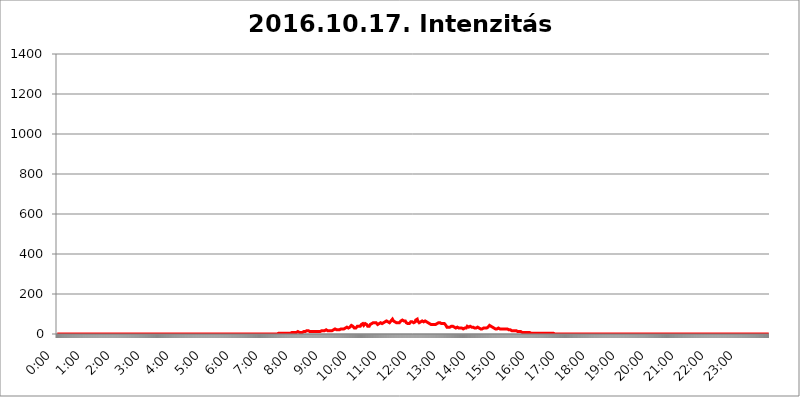
| Category | 2016.10.17. Intenzitás [W/m^2] |
|---|---|
| 0.0 | 0 |
| 0.0006944444444444445 | 0 |
| 0.001388888888888889 | 0 |
| 0.0020833333333333333 | 0 |
| 0.002777777777777778 | 0 |
| 0.003472222222222222 | 0 |
| 0.004166666666666667 | 0 |
| 0.004861111111111111 | 0 |
| 0.005555555555555556 | 0 |
| 0.0062499999999999995 | 0 |
| 0.006944444444444444 | 0 |
| 0.007638888888888889 | 0 |
| 0.008333333333333333 | 0 |
| 0.009027777777777779 | 0 |
| 0.009722222222222222 | 0 |
| 0.010416666666666666 | 0 |
| 0.011111111111111112 | 0 |
| 0.011805555555555555 | 0 |
| 0.012499999999999999 | 0 |
| 0.013194444444444444 | 0 |
| 0.013888888888888888 | 0 |
| 0.014583333333333332 | 0 |
| 0.015277777777777777 | 0 |
| 0.015972222222222224 | 0 |
| 0.016666666666666666 | 0 |
| 0.017361111111111112 | 0 |
| 0.018055555555555557 | 0 |
| 0.01875 | 0 |
| 0.019444444444444445 | 0 |
| 0.02013888888888889 | 0 |
| 0.020833333333333332 | 0 |
| 0.02152777777777778 | 0 |
| 0.022222222222222223 | 0 |
| 0.02291666666666667 | 0 |
| 0.02361111111111111 | 0 |
| 0.024305555555555556 | 0 |
| 0.024999999999999998 | 0 |
| 0.025694444444444447 | 0 |
| 0.02638888888888889 | 0 |
| 0.027083333333333334 | 0 |
| 0.027777777777777776 | 0 |
| 0.02847222222222222 | 0 |
| 0.029166666666666664 | 0 |
| 0.029861111111111113 | 0 |
| 0.030555555555555555 | 0 |
| 0.03125 | 0 |
| 0.03194444444444445 | 0 |
| 0.03263888888888889 | 0 |
| 0.03333333333333333 | 0 |
| 0.034027777777777775 | 0 |
| 0.034722222222222224 | 0 |
| 0.035416666666666666 | 0 |
| 0.036111111111111115 | 0 |
| 0.03680555555555556 | 0 |
| 0.0375 | 0 |
| 0.03819444444444444 | 0 |
| 0.03888888888888889 | 0 |
| 0.03958333333333333 | 0 |
| 0.04027777777777778 | 0 |
| 0.04097222222222222 | 0 |
| 0.041666666666666664 | 0 |
| 0.042361111111111106 | 0 |
| 0.04305555555555556 | 0 |
| 0.043750000000000004 | 0 |
| 0.044444444444444446 | 0 |
| 0.04513888888888889 | 0 |
| 0.04583333333333334 | 0 |
| 0.04652777777777778 | 0 |
| 0.04722222222222222 | 0 |
| 0.04791666666666666 | 0 |
| 0.04861111111111111 | 0 |
| 0.049305555555555554 | 0 |
| 0.049999999999999996 | 0 |
| 0.05069444444444445 | 0 |
| 0.051388888888888894 | 0 |
| 0.052083333333333336 | 0 |
| 0.05277777777777778 | 0 |
| 0.05347222222222222 | 0 |
| 0.05416666666666667 | 0 |
| 0.05486111111111111 | 0 |
| 0.05555555555555555 | 0 |
| 0.05625 | 0 |
| 0.05694444444444444 | 0 |
| 0.057638888888888885 | 0 |
| 0.05833333333333333 | 0 |
| 0.05902777777777778 | 0 |
| 0.059722222222222225 | 0 |
| 0.06041666666666667 | 0 |
| 0.061111111111111116 | 0 |
| 0.06180555555555556 | 0 |
| 0.0625 | 0 |
| 0.06319444444444444 | 0 |
| 0.06388888888888888 | 0 |
| 0.06458333333333334 | 0 |
| 0.06527777777777778 | 0 |
| 0.06597222222222222 | 0 |
| 0.06666666666666667 | 0 |
| 0.06736111111111111 | 0 |
| 0.06805555555555555 | 0 |
| 0.06874999999999999 | 0 |
| 0.06944444444444443 | 0 |
| 0.07013888888888889 | 0 |
| 0.07083333333333333 | 0 |
| 0.07152777777777779 | 0 |
| 0.07222222222222223 | 0 |
| 0.07291666666666667 | 0 |
| 0.07361111111111111 | 0 |
| 0.07430555555555556 | 0 |
| 0.075 | 0 |
| 0.07569444444444444 | 0 |
| 0.0763888888888889 | 0 |
| 0.07708333333333334 | 0 |
| 0.07777777777777778 | 0 |
| 0.07847222222222222 | 0 |
| 0.07916666666666666 | 0 |
| 0.0798611111111111 | 0 |
| 0.08055555555555556 | 0 |
| 0.08125 | 0 |
| 0.08194444444444444 | 0 |
| 0.08263888888888889 | 0 |
| 0.08333333333333333 | 0 |
| 0.08402777777777777 | 0 |
| 0.08472222222222221 | 0 |
| 0.08541666666666665 | 0 |
| 0.08611111111111112 | 0 |
| 0.08680555555555557 | 0 |
| 0.08750000000000001 | 0 |
| 0.08819444444444445 | 0 |
| 0.08888888888888889 | 0 |
| 0.08958333333333333 | 0 |
| 0.09027777777777778 | 0 |
| 0.09097222222222222 | 0 |
| 0.09166666666666667 | 0 |
| 0.09236111111111112 | 0 |
| 0.09305555555555556 | 0 |
| 0.09375 | 0 |
| 0.09444444444444444 | 0 |
| 0.09513888888888888 | 0 |
| 0.09583333333333333 | 0 |
| 0.09652777777777777 | 0 |
| 0.09722222222222222 | 0 |
| 0.09791666666666667 | 0 |
| 0.09861111111111111 | 0 |
| 0.09930555555555555 | 0 |
| 0.09999999999999999 | 0 |
| 0.10069444444444443 | 0 |
| 0.1013888888888889 | 0 |
| 0.10208333333333335 | 0 |
| 0.10277777777777779 | 0 |
| 0.10347222222222223 | 0 |
| 0.10416666666666667 | 0 |
| 0.10486111111111111 | 0 |
| 0.10555555555555556 | 0 |
| 0.10625 | 0 |
| 0.10694444444444444 | 0 |
| 0.1076388888888889 | 0 |
| 0.10833333333333334 | 0 |
| 0.10902777777777778 | 0 |
| 0.10972222222222222 | 0 |
| 0.1111111111111111 | 0 |
| 0.11180555555555556 | 0 |
| 0.11180555555555556 | 0 |
| 0.1125 | 0 |
| 0.11319444444444444 | 0 |
| 0.11388888888888889 | 0 |
| 0.11458333333333333 | 0 |
| 0.11527777777777777 | 0 |
| 0.11597222222222221 | 0 |
| 0.11666666666666665 | 0 |
| 0.1173611111111111 | 0 |
| 0.11805555555555557 | 0 |
| 0.11944444444444445 | 0 |
| 0.12013888888888889 | 0 |
| 0.12083333333333333 | 0 |
| 0.12152777777777778 | 0 |
| 0.12222222222222223 | 0 |
| 0.12291666666666667 | 0 |
| 0.12291666666666667 | 0 |
| 0.12361111111111112 | 0 |
| 0.12430555555555556 | 0 |
| 0.125 | 0 |
| 0.12569444444444444 | 0 |
| 0.12638888888888888 | 0 |
| 0.12708333333333333 | 0 |
| 0.16875 | 0 |
| 0.12847222222222224 | 0 |
| 0.12916666666666668 | 0 |
| 0.12986111111111112 | 0 |
| 0.13055555555555556 | 0 |
| 0.13125 | 0 |
| 0.13194444444444445 | 0 |
| 0.1326388888888889 | 0 |
| 0.13333333333333333 | 0 |
| 0.13402777777777777 | 0 |
| 0.13402777777777777 | 0 |
| 0.13472222222222222 | 0 |
| 0.13541666666666666 | 0 |
| 0.1361111111111111 | 0 |
| 0.13749999999999998 | 0 |
| 0.13819444444444443 | 0 |
| 0.1388888888888889 | 0 |
| 0.13958333333333334 | 0 |
| 0.14027777777777778 | 0 |
| 0.14097222222222222 | 0 |
| 0.14166666666666666 | 0 |
| 0.1423611111111111 | 0 |
| 0.14305555555555557 | 0 |
| 0.14375000000000002 | 0 |
| 0.14444444444444446 | 0 |
| 0.1451388888888889 | 0 |
| 0.1451388888888889 | 0 |
| 0.14652777777777778 | 0 |
| 0.14722222222222223 | 0 |
| 0.14791666666666667 | 0 |
| 0.1486111111111111 | 0 |
| 0.14930555555555555 | 0 |
| 0.15 | 0 |
| 0.15069444444444444 | 0 |
| 0.15138888888888888 | 0 |
| 0.15208333333333332 | 0 |
| 0.15277777777777776 | 0 |
| 0.15347222222222223 | 0 |
| 0.15416666666666667 | 0 |
| 0.15486111111111112 | 0 |
| 0.15555555555555556 | 0 |
| 0.15625 | 0 |
| 0.15694444444444444 | 0 |
| 0.15763888888888888 | 0 |
| 0.15833333333333333 | 0 |
| 0.15902777777777777 | 0 |
| 0.15972222222222224 | 0 |
| 0.16041666666666668 | 0 |
| 0.16111111111111112 | 0 |
| 0.16180555555555556 | 0 |
| 0.1625 | 0 |
| 0.16319444444444445 | 0 |
| 0.1638888888888889 | 0 |
| 0.16458333333333333 | 0 |
| 0.16527777777777777 | 0 |
| 0.16597222222222222 | 0 |
| 0.16666666666666666 | 0 |
| 0.1673611111111111 | 0 |
| 0.16805555555555554 | 0 |
| 0.16874999999999998 | 0 |
| 0.16944444444444443 | 0 |
| 0.17013888888888887 | 0 |
| 0.1708333333333333 | 0 |
| 0.17152777777777775 | 0 |
| 0.17222222222222225 | 0 |
| 0.1729166666666667 | 0 |
| 0.17361111111111113 | 0 |
| 0.17430555555555557 | 0 |
| 0.17500000000000002 | 0 |
| 0.17569444444444446 | 0 |
| 0.1763888888888889 | 0 |
| 0.17708333333333334 | 0 |
| 0.17777777777777778 | 0 |
| 0.17847222222222223 | 0 |
| 0.17916666666666667 | 0 |
| 0.1798611111111111 | 0 |
| 0.18055555555555555 | 0 |
| 0.18125 | 0 |
| 0.18194444444444444 | 0 |
| 0.1826388888888889 | 0 |
| 0.18333333333333335 | 0 |
| 0.1840277777777778 | 0 |
| 0.18472222222222223 | 0 |
| 0.18541666666666667 | 0 |
| 0.18611111111111112 | 0 |
| 0.18680555555555556 | 0 |
| 0.1875 | 0 |
| 0.18819444444444444 | 0 |
| 0.18888888888888888 | 0 |
| 0.18958333333333333 | 0 |
| 0.19027777777777777 | 0 |
| 0.1909722222222222 | 0 |
| 0.19166666666666665 | 0 |
| 0.19236111111111112 | 0 |
| 0.19305555555555554 | 0 |
| 0.19375 | 0 |
| 0.19444444444444445 | 0 |
| 0.1951388888888889 | 0 |
| 0.19583333333333333 | 0 |
| 0.19652777777777777 | 0 |
| 0.19722222222222222 | 0 |
| 0.19791666666666666 | 0 |
| 0.1986111111111111 | 0 |
| 0.19930555555555554 | 0 |
| 0.19999999999999998 | 0 |
| 0.20069444444444443 | 0 |
| 0.20138888888888887 | 0 |
| 0.2020833333333333 | 0 |
| 0.2027777777777778 | 0 |
| 0.2034722222222222 | 0 |
| 0.2041666666666667 | 0 |
| 0.20486111111111113 | 0 |
| 0.20555555555555557 | 0 |
| 0.20625000000000002 | 0 |
| 0.20694444444444446 | 0 |
| 0.2076388888888889 | 0 |
| 0.20833333333333334 | 0 |
| 0.20902777777777778 | 0 |
| 0.20972222222222223 | 0 |
| 0.21041666666666667 | 0 |
| 0.2111111111111111 | 0 |
| 0.21180555555555555 | 0 |
| 0.2125 | 0 |
| 0.21319444444444444 | 0 |
| 0.2138888888888889 | 0 |
| 0.21458333333333335 | 0 |
| 0.2152777777777778 | 0 |
| 0.21597222222222223 | 0 |
| 0.21666666666666667 | 0 |
| 0.21736111111111112 | 0 |
| 0.21805555555555556 | 0 |
| 0.21875 | 0 |
| 0.21944444444444444 | 0 |
| 0.22013888888888888 | 0 |
| 0.22083333333333333 | 0 |
| 0.22152777777777777 | 0 |
| 0.2222222222222222 | 0 |
| 0.22291666666666665 | 0 |
| 0.2236111111111111 | 0 |
| 0.22430555555555556 | 0 |
| 0.225 | 0 |
| 0.22569444444444445 | 0 |
| 0.2263888888888889 | 0 |
| 0.22708333333333333 | 0 |
| 0.22777777777777777 | 0 |
| 0.22847222222222222 | 0 |
| 0.22916666666666666 | 0 |
| 0.2298611111111111 | 0 |
| 0.23055555555555554 | 0 |
| 0.23124999999999998 | 0 |
| 0.23194444444444443 | 0 |
| 0.23263888888888887 | 0 |
| 0.2333333333333333 | 0 |
| 0.2340277777777778 | 0 |
| 0.2347222222222222 | 0 |
| 0.2354166666666667 | 0 |
| 0.23611111111111113 | 0 |
| 0.23680555555555557 | 0 |
| 0.23750000000000002 | 0 |
| 0.23819444444444446 | 0 |
| 0.2388888888888889 | 0 |
| 0.23958333333333334 | 0 |
| 0.24027777777777778 | 0 |
| 0.24097222222222223 | 0 |
| 0.24166666666666667 | 0 |
| 0.2423611111111111 | 0 |
| 0.24305555555555555 | 0 |
| 0.24375 | 0 |
| 0.24444444444444446 | 0 |
| 0.24513888888888888 | 0 |
| 0.24583333333333335 | 0 |
| 0.2465277777777778 | 0 |
| 0.24722222222222223 | 0 |
| 0.24791666666666667 | 0 |
| 0.24861111111111112 | 0 |
| 0.24930555555555556 | 0 |
| 0.25 | 0 |
| 0.25069444444444444 | 0 |
| 0.2513888888888889 | 0 |
| 0.2520833333333333 | 0 |
| 0.25277777777777777 | 0 |
| 0.2534722222222222 | 0 |
| 0.25416666666666665 | 0 |
| 0.2548611111111111 | 0 |
| 0.2555555555555556 | 0 |
| 0.25625000000000003 | 0 |
| 0.2569444444444445 | 0 |
| 0.2576388888888889 | 0 |
| 0.25833333333333336 | 0 |
| 0.2590277777777778 | 0 |
| 0.25972222222222224 | 0 |
| 0.2604166666666667 | 0 |
| 0.2611111111111111 | 0 |
| 0.26180555555555557 | 0 |
| 0.2625 | 0 |
| 0.26319444444444445 | 0 |
| 0.2638888888888889 | 0 |
| 0.26458333333333334 | 0 |
| 0.2652777777777778 | 0 |
| 0.2659722222222222 | 0 |
| 0.26666666666666666 | 0 |
| 0.2673611111111111 | 0 |
| 0.26805555555555555 | 0 |
| 0.26875 | 0 |
| 0.26944444444444443 | 0 |
| 0.2701388888888889 | 0 |
| 0.2708333333333333 | 0 |
| 0.27152777777777776 | 0 |
| 0.2722222222222222 | 0 |
| 0.27291666666666664 | 0 |
| 0.2736111111111111 | 0 |
| 0.2743055555555555 | 0 |
| 0.27499999999999997 | 0 |
| 0.27569444444444446 | 0 |
| 0.27638888888888885 | 0 |
| 0.27708333333333335 | 0 |
| 0.2777777777777778 | 0 |
| 0.27847222222222223 | 0 |
| 0.2791666666666667 | 0 |
| 0.2798611111111111 | 0 |
| 0.28055555555555556 | 0 |
| 0.28125 | 0 |
| 0.28194444444444444 | 0 |
| 0.2826388888888889 | 0 |
| 0.2833333333333333 | 0 |
| 0.28402777777777777 | 0 |
| 0.2847222222222222 | 0 |
| 0.28541666666666665 | 0 |
| 0.28611111111111115 | 0 |
| 0.28680555555555554 | 0 |
| 0.28750000000000003 | 0 |
| 0.2881944444444445 | 0 |
| 0.2888888888888889 | 0 |
| 0.28958333333333336 | 0 |
| 0.2902777777777778 | 0 |
| 0.29097222222222224 | 0 |
| 0.2916666666666667 | 0 |
| 0.2923611111111111 | 0 |
| 0.29305555555555557 | 0 |
| 0.29375 | 0 |
| 0.29444444444444445 | 0 |
| 0.2951388888888889 | 0 |
| 0.29583333333333334 | 0 |
| 0.2965277777777778 | 0 |
| 0.2972222222222222 | 0 |
| 0.29791666666666666 | 0 |
| 0.2986111111111111 | 0 |
| 0.29930555555555555 | 0 |
| 0.3 | 0 |
| 0.30069444444444443 | 0 |
| 0.3013888888888889 | 0 |
| 0.3020833333333333 | 0 |
| 0.30277777777777776 | 0 |
| 0.3034722222222222 | 0 |
| 0.30416666666666664 | 0 |
| 0.3048611111111111 | 0 |
| 0.3055555555555555 | 0 |
| 0.30624999999999997 | 0 |
| 0.3069444444444444 | 0 |
| 0.3076388888888889 | 0 |
| 0.30833333333333335 | 0 |
| 0.3090277777777778 | 0 |
| 0.30972222222222223 | 0 |
| 0.3104166666666667 | 3.525 |
| 0.3111111111111111 | 3.525 |
| 0.31180555555555556 | 3.525 |
| 0.3125 | 3.525 |
| 0.31319444444444444 | 3.525 |
| 0.3138888888888889 | 3.525 |
| 0.3145833333333333 | 3.525 |
| 0.31527777777777777 | 3.525 |
| 0.3159722222222222 | 0 |
| 0.31666666666666665 | 3.525 |
| 0.31736111111111115 | 3.525 |
| 0.31805555555555554 | 3.525 |
| 0.31875000000000003 | 3.525 |
| 0.3194444444444445 | 3.525 |
| 0.3201388888888889 | 3.525 |
| 0.32083333333333336 | 3.525 |
| 0.3215277777777778 | 3.525 |
| 0.32222222222222224 | 3.525 |
| 0.3229166666666667 | 3.525 |
| 0.3236111111111111 | 3.525 |
| 0.32430555555555557 | 3.525 |
| 0.325 | 3.525 |
| 0.32569444444444445 | 3.525 |
| 0.3263888888888889 | 3.525 |
| 0.32708333333333334 | 3.525 |
| 0.3277777777777778 | 3.525 |
| 0.3284722222222222 | 3.525 |
| 0.32916666666666666 | 7.887 |
| 0.3298611111111111 | 7.887 |
| 0.33055555555555555 | 7.887 |
| 0.33125 | 7.887 |
| 0.33194444444444443 | 7.887 |
| 0.3326388888888889 | 7.887 |
| 0.3333333333333333 | 7.887 |
| 0.3340277777777778 | 3.525 |
| 0.3347222222222222 | 7.887 |
| 0.3354166666666667 | 7.887 |
| 0.3361111111111111 | 7.887 |
| 0.3368055555555556 | 7.887 |
| 0.33749999999999997 | 12.257 |
| 0.33819444444444446 | 12.257 |
| 0.33888888888888885 | 7.887 |
| 0.33958333333333335 | 7.887 |
| 0.34027777777777773 | 7.887 |
| 0.34097222222222223 | 7.887 |
| 0.3416666666666666 | 7.887 |
| 0.3423611111111111 | 7.887 |
| 0.3430555555555555 | 7.887 |
| 0.34375 | 7.887 |
| 0.3444444444444445 | 7.887 |
| 0.3451388888888889 | 7.887 |
| 0.3458333333333334 | 12.257 |
| 0.34652777777777777 | 12.257 |
| 0.34722222222222227 | 12.257 |
| 0.34791666666666665 | 12.257 |
| 0.34861111111111115 | 16.636 |
| 0.34930555555555554 | 16.636 |
| 0.35000000000000003 | 16.636 |
| 0.3506944444444444 | 16.636 |
| 0.3513888888888889 | 16.636 |
| 0.3520833333333333 | 16.636 |
| 0.3527777777777778 | 12.257 |
| 0.3534722222222222 | 16.636 |
| 0.3541666666666667 | 12.257 |
| 0.3548611111111111 | 16.636 |
| 0.35555555555555557 | 16.636 |
| 0.35625 | 12.257 |
| 0.35694444444444445 | 12.257 |
| 0.3576388888888889 | 12.257 |
| 0.35833333333333334 | 12.257 |
| 0.3590277777777778 | 12.257 |
| 0.3597222222222222 | 12.257 |
| 0.36041666666666666 | 12.257 |
| 0.3611111111111111 | 12.257 |
| 0.36180555555555555 | 12.257 |
| 0.3625 | 12.257 |
| 0.36319444444444443 | 12.257 |
| 0.3638888888888889 | 12.257 |
| 0.3645833333333333 | 12.257 |
| 0.3652777777777778 | 12.257 |
| 0.3659722222222222 | 12.257 |
| 0.3666666666666667 | 12.257 |
| 0.3673611111111111 | 12.257 |
| 0.3680555555555556 | 12.257 |
| 0.36874999999999997 | 12.257 |
| 0.36944444444444446 | 12.257 |
| 0.37013888888888885 | 12.257 |
| 0.37083333333333335 | 16.636 |
| 0.37152777777777773 | 16.636 |
| 0.37222222222222223 | 16.636 |
| 0.3729166666666666 | 16.636 |
| 0.3736111111111111 | 16.636 |
| 0.3743055555555555 | 16.636 |
| 0.375 | 16.636 |
| 0.3756944444444445 | 16.636 |
| 0.3763888888888889 | 16.636 |
| 0.3770833333333334 | 21.024 |
| 0.37777777777777777 | 16.636 |
| 0.37847222222222227 | 16.636 |
| 0.37916666666666665 | 16.636 |
| 0.37986111111111115 | 16.636 |
| 0.38055555555555554 | 16.636 |
| 0.38125000000000003 | 16.636 |
| 0.3819444444444444 | 21.024 |
| 0.3826388888888889 | 16.636 |
| 0.3833333333333333 | 16.636 |
| 0.3840277777777778 | 16.636 |
| 0.3847222222222222 | 16.636 |
| 0.3854166666666667 | 16.636 |
| 0.3861111111111111 | 21.024 |
| 0.38680555555555557 | 21.024 |
| 0.3875 | 21.024 |
| 0.38819444444444445 | 21.024 |
| 0.3888888888888889 | 21.024 |
| 0.38958333333333334 | 25.419 |
| 0.3902777777777778 | 25.419 |
| 0.3909722222222222 | 25.419 |
| 0.39166666666666666 | 21.024 |
| 0.3923611111111111 | 21.024 |
| 0.39305555555555555 | 21.024 |
| 0.39375 | 21.024 |
| 0.39444444444444443 | 21.024 |
| 0.3951388888888889 | 21.024 |
| 0.3958333333333333 | 21.024 |
| 0.3965277777777778 | 21.024 |
| 0.3972222222222222 | 25.419 |
| 0.3979166666666667 | 25.419 |
| 0.3986111111111111 | 25.419 |
| 0.3993055555555556 | 29.823 |
| 0.39999999999999997 | 25.419 |
| 0.40069444444444446 | 25.419 |
| 0.40138888888888885 | 25.419 |
| 0.40208333333333335 | 25.419 |
| 0.40277777777777773 | 29.823 |
| 0.40347222222222223 | 29.823 |
| 0.4041666666666666 | 29.823 |
| 0.4048611111111111 | 29.823 |
| 0.4055555555555555 | 34.234 |
| 0.40625 | 34.234 |
| 0.4069444444444445 | 34.234 |
| 0.4076388888888889 | 34.234 |
| 0.4083333333333334 | 29.823 |
| 0.40902777777777777 | 29.823 |
| 0.40972222222222227 | 34.234 |
| 0.41041666666666665 | 34.234 |
| 0.41111111111111115 | 38.653 |
| 0.41180555555555554 | 38.653 |
| 0.41250000000000003 | 43.079 |
| 0.4131944444444444 | 38.653 |
| 0.4138888888888889 | 38.653 |
| 0.4145833333333333 | 38.653 |
| 0.4152777777777778 | 34.234 |
| 0.4159722222222222 | 34.234 |
| 0.4166666666666667 | 29.823 |
| 0.4173611111111111 | 29.823 |
| 0.41805555555555557 | 29.823 |
| 0.41875 | 29.823 |
| 0.41944444444444445 | 29.823 |
| 0.4201388888888889 | 34.234 |
| 0.42083333333333334 | 38.653 |
| 0.4215277777777778 | 38.653 |
| 0.4222222222222222 | 38.653 |
| 0.42291666666666666 | 38.653 |
| 0.4236111111111111 | 38.653 |
| 0.42430555555555555 | 38.653 |
| 0.425 | 38.653 |
| 0.42569444444444443 | 43.079 |
| 0.4263888888888889 | 47.511 |
| 0.4270833333333333 | 47.511 |
| 0.4277777777777778 | 51.951 |
| 0.4284722222222222 | 51.951 |
| 0.4291666666666667 | 47.511 |
| 0.4298611111111111 | 43.079 |
| 0.4305555555555556 | 43.079 |
| 0.43124999999999997 | 47.511 |
| 0.43194444444444446 | 51.951 |
| 0.43263888888888885 | 51.951 |
| 0.43333333333333335 | 47.511 |
| 0.43402777777777773 | 47.511 |
| 0.43472222222222223 | 43.079 |
| 0.4354166666666666 | 38.653 |
| 0.4361111111111111 | 38.653 |
| 0.4368055555555555 | 38.653 |
| 0.4375 | 38.653 |
| 0.4381944444444445 | 43.079 |
| 0.4388888888888889 | 47.511 |
| 0.4395833333333334 | 47.511 |
| 0.44027777777777777 | 47.511 |
| 0.44097222222222227 | 51.951 |
| 0.44166666666666665 | 51.951 |
| 0.44236111111111115 | 51.951 |
| 0.44305555555555554 | 56.398 |
| 0.44375000000000003 | 60.85 |
| 0.4444444444444444 | 56.398 |
| 0.4451388888888889 | 56.398 |
| 0.4458333333333333 | 56.398 |
| 0.4465277777777778 | 60.85 |
| 0.4472222222222222 | 56.398 |
| 0.4479166666666667 | 56.398 |
| 0.4486111111111111 | 51.951 |
| 0.44930555555555557 | 47.511 |
| 0.45 | 47.511 |
| 0.45069444444444445 | 47.511 |
| 0.4513888888888889 | 51.951 |
| 0.45208333333333334 | 56.398 |
| 0.4527777777777778 | 56.398 |
| 0.4534722222222222 | 56.398 |
| 0.45416666666666666 | 51.951 |
| 0.4548611111111111 | 51.951 |
| 0.45555555555555555 | 51.951 |
| 0.45625 | 56.398 |
| 0.45694444444444443 | 56.398 |
| 0.4576388888888889 | 56.398 |
| 0.4583333333333333 | 51.951 |
| 0.4590277777777778 | 56.398 |
| 0.4597222222222222 | 60.85 |
| 0.4604166666666667 | 65.31 |
| 0.4611111111111111 | 65.31 |
| 0.4618055555555556 | 65.31 |
| 0.46249999999999997 | 60.85 |
| 0.46319444444444446 | 65.31 |
| 0.46388888888888885 | 60.85 |
| 0.46458333333333335 | 60.85 |
| 0.46527777777777773 | 60.85 |
| 0.46597222222222223 | 56.398 |
| 0.4666666666666666 | 56.398 |
| 0.4673611111111111 | 60.85 |
| 0.4680555555555555 | 65.31 |
| 0.46875 | 65.31 |
| 0.4694444444444445 | 69.775 |
| 0.4701388888888889 | 74.246 |
| 0.4708333333333334 | 69.775 |
| 0.47152777777777777 | 65.31 |
| 0.47222222222222227 | 60.85 |
| 0.47291666666666665 | 60.85 |
| 0.47361111111111115 | 60.85 |
| 0.47430555555555554 | 60.85 |
| 0.47500000000000003 | 60.85 |
| 0.4756944444444444 | 56.398 |
| 0.4763888888888889 | 56.398 |
| 0.4770833333333333 | 56.398 |
| 0.4777777777777778 | 56.398 |
| 0.4784722222222222 | 56.398 |
| 0.4791666666666667 | 56.398 |
| 0.4798611111111111 | 56.398 |
| 0.48055555555555557 | 60.85 |
| 0.48125 | 60.85 |
| 0.48194444444444445 | 65.31 |
| 0.4826388888888889 | 69.775 |
| 0.48333333333333334 | 69.775 |
| 0.4840277777777778 | 69.775 |
| 0.4847222222222222 | 69.775 |
| 0.48541666666666666 | 65.31 |
| 0.4861111111111111 | 65.31 |
| 0.48680555555555555 | 69.775 |
| 0.4875 | 69.775 |
| 0.48819444444444443 | 65.31 |
| 0.4888888888888889 | 60.85 |
| 0.4895833333333333 | 56.398 |
| 0.4902777777777778 | 56.398 |
| 0.4909722222222222 | 56.398 |
| 0.4916666666666667 | 51.951 |
| 0.4923611111111111 | 51.951 |
| 0.4930555555555556 | 51.951 |
| 0.49374999999999997 | 51.951 |
| 0.49444444444444446 | 56.398 |
| 0.49513888888888885 | 56.398 |
| 0.49583333333333335 | 60.85 |
| 0.49652777777777773 | 65.31 |
| 0.49722222222222223 | 65.31 |
| 0.4979166666666666 | 60.85 |
| 0.4986111111111111 | 56.398 |
| 0.4993055555555555 | 56.398 |
| 0.5 | 56.398 |
| 0.5006944444444444 | 56.398 |
| 0.5013888888888889 | 56.398 |
| 0.5020833333333333 | 60.85 |
| 0.5027777777777778 | 69.775 |
| 0.5034722222222222 | 74.246 |
| 0.5041666666666667 | 74.246 |
| 0.5048611111111111 | 74.246 |
| 0.5055555555555555 | 65.31 |
| 0.50625 | 65.31 |
| 0.5069444444444444 | 60.85 |
| 0.5076388888888889 | 56.398 |
| 0.5083333333333333 | 56.398 |
| 0.5090277777777777 | 60.85 |
| 0.5097222222222222 | 60.85 |
| 0.5104166666666666 | 60.85 |
| 0.5111111111111112 | 65.31 |
| 0.5118055555555555 | 65.31 |
| 0.5125000000000001 | 65.31 |
| 0.5131944444444444 | 60.85 |
| 0.513888888888889 | 60.85 |
| 0.5145833333333333 | 65.31 |
| 0.5152777777777778 | 65.31 |
| 0.5159722222222222 | 65.31 |
| 0.5166666666666667 | 65.31 |
| 0.517361111111111 | 60.85 |
| 0.5180555555555556 | 60.85 |
| 0.5187499999999999 | 56.398 |
| 0.5194444444444445 | 56.398 |
| 0.5201388888888888 | 56.398 |
| 0.5208333333333334 | 51.951 |
| 0.5215277777777778 | 51.951 |
| 0.5222222222222223 | 51.951 |
| 0.5229166666666667 | 47.511 |
| 0.5236111111111111 | 47.511 |
| 0.5243055555555556 | 47.511 |
| 0.525 | 51.951 |
| 0.5256944444444445 | 47.511 |
| 0.5263888888888889 | 47.511 |
| 0.5270833333333333 | 47.511 |
| 0.5277777777777778 | 47.511 |
| 0.5284722222222222 | 47.511 |
| 0.5291666666666667 | 47.511 |
| 0.5298611111111111 | 47.511 |
| 0.5305555555555556 | 47.511 |
| 0.53125 | 47.511 |
| 0.5319444444444444 | 47.511 |
| 0.5326388888888889 | 51.951 |
| 0.5333333333333333 | 51.951 |
| 0.5340277777777778 | 51.951 |
| 0.5347222222222222 | 56.398 |
| 0.5354166666666667 | 56.398 |
| 0.5361111111111111 | 56.398 |
| 0.5368055555555555 | 56.398 |
| 0.5375 | 51.951 |
| 0.5381944444444444 | 51.951 |
| 0.5388888888888889 | 51.951 |
| 0.5395833333333333 | 47.511 |
| 0.5402777777777777 | 47.511 |
| 0.5409722222222222 | 51.951 |
| 0.5416666666666666 | 51.951 |
| 0.5423611111111112 | 51.951 |
| 0.5430555555555555 | 51.951 |
| 0.5437500000000001 | 51.951 |
| 0.5444444444444444 | 47.511 |
| 0.545138888888889 | 43.079 |
| 0.5458333333333333 | 38.653 |
| 0.5465277777777778 | 34.234 |
| 0.5472222222222222 | 29.823 |
| 0.5479166666666667 | 29.823 |
| 0.548611111111111 | 34.234 |
| 0.5493055555555556 | 34.234 |
| 0.5499999999999999 | 34.234 |
| 0.5506944444444445 | 34.234 |
| 0.5513888888888888 | 38.653 |
| 0.5520833333333334 | 38.653 |
| 0.5527777777777778 | 38.653 |
| 0.5534722222222223 | 38.653 |
| 0.5541666666666667 | 38.653 |
| 0.5548611111111111 | 38.653 |
| 0.5555555555555556 | 38.653 |
| 0.55625 | 38.653 |
| 0.5569444444444445 | 34.234 |
| 0.5576388888888889 | 34.234 |
| 0.5583333333333333 | 29.823 |
| 0.5590277777777778 | 29.823 |
| 0.5597222222222222 | 29.823 |
| 0.5604166666666667 | 34.234 |
| 0.5611111111111111 | 34.234 |
| 0.5618055555555556 | 34.234 |
| 0.5625 | 34.234 |
| 0.5631944444444444 | 29.823 |
| 0.5638888888888889 | 29.823 |
| 0.5645833333333333 | 29.823 |
| 0.5652777777777778 | 29.823 |
| 0.5659722222222222 | 29.823 |
| 0.5666666666666667 | 29.823 |
| 0.5673611111111111 | 29.823 |
| 0.5680555555555555 | 29.823 |
| 0.56875 | 29.823 |
| 0.5694444444444444 | 25.419 |
| 0.5701388888888889 | 29.823 |
| 0.5708333333333333 | 29.823 |
| 0.5715277777777777 | 29.823 |
| 0.5722222222222222 | 29.823 |
| 0.5729166666666666 | 25.419 |
| 0.5736111111111112 | 29.823 |
| 0.5743055555555555 | 34.234 |
| 0.5750000000000001 | 38.653 |
| 0.5756944444444444 | 38.653 |
| 0.576388888888889 | 38.653 |
| 0.5770833333333333 | 34.234 |
| 0.5777777777777778 | 34.234 |
| 0.5784722222222222 | 38.653 |
| 0.5791666666666667 | 38.653 |
| 0.579861111111111 | 34.234 |
| 0.5805555555555556 | 34.234 |
| 0.5812499999999999 | 34.234 |
| 0.5819444444444445 | 34.234 |
| 0.5826388888888888 | 34.234 |
| 0.5833333333333334 | 34.234 |
| 0.5840277777777778 | 29.823 |
| 0.5847222222222223 | 29.823 |
| 0.5854166666666667 | 29.823 |
| 0.5861111111111111 | 29.823 |
| 0.5868055555555556 | 34.234 |
| 0.5875 | 29.823 |
| 0.5881944444444445 | 29.823 |
| 0.5888888888888889 | 34.234 |
| 0.5895833333333333 | 34.234 |
| 0.5902777777777778 | 34.234 |
| 0.5909722222222222 | 29.823 |
| 0.5916666666666667 | 29.823 |
| 0.5923611111111111 | 29.823 |
| 0.5930555555555556 | 29.823 |
| 0.59375 | 25.419 |
| 0.5944444444444444 | 21.024 |
| 0.5951388888888889 | 21.024 |
| 0.5958333333333333 | 25.419 |
| 0.5965277777777778 | 25.419 |
| 0.5972222222222222 | 25.419 |
| 0.5979166666666667 | 29.823 |
| 0.5986111111111111 | 29.823 |
| 0.5993055555555555 | 29.823 |
| 0.6 | 29.823 |
| 0.6006944444444444 | 29.823 |
| 0.6013888888888889 | 29.823 |
| 0.6020833333333333 | 29.823 |
| 0.6027777777777777 | 29.823 |
| 0.6034722222222222 | 29.823 |
| 0.6041666666666666 | 34.234 |
| 0.6048611111111112 | 38.653 |
| 0.6055555555555555 | 38.653 |
| 0.6062500000000001 | 43.079 |
| 0.6069444444444444 | 43.079 |
| 0.607638888888889 | 43.079 |
| 0.6083333333333333 | 38.653 |
| 0.6090277777777778 | 38.653 |
| 0.6097222222222222 | 34.234 |
| 0.6104166666666667 | 34.234 |
| 0.611111111111111 | 34.234 |
| 0.6118055555555556 | 29.823 |
| 0.6124999999999999 | 29.823 |
| 0.6131944444444445 | 25.419 |
| 0.6138888888888888 | 25.419 |
| 0.6145833333333334 | 25.419 |
| 0.6152777777777778 | 25.419 |
| 0.6159722222222223 | 25.419 |
| 0.6166666666666667 | 25.419 |
| 0.6173611111111111 | 25.419 |
| 0.6180555555555556 | 29.823 |
| 0.61875 | 29.823 |
| 0.6194444444444445 | 25.419 |
| 0.6201388888888889 | 25.419 |
| 0.6208333333333333 | 25.419 |
| 0.6215277777777778 | 25.419 |
| 0.6222222222222222 | 25.419 |
| 0.6229166666666667 | 25.419 |
| 0.6236111111111111 | 25.419 |
| 0.6243055555555556 | 25.419 |
| 0.625 | 25.419 |
| 0.6256944444444444 | 21.024 |
| 0.6263888888888889 | 25.419 |
| 0.6270833333333333 | 25.419 |
| 0.6277777777777778 | 25.419 |
| 0.6284722222222222 | 25.419 |
| 0.6291666666666667 | 25.419 |
| 0.6298611111111111 | 25.419 |
| 0.6305555555555555 | 25.419 |
| 0.63125 | 25.419 |
| 0.6319444444444444 | 21.024 |
| 0.6326388888888889 | 21.024 |
| 0.6333333333333333 | 21.024 |
| 0.6340277777777777 | 21.024 |
| 0.6347222222222222 | 21.024 |
| 0.6354166666666666 | 21.024 |
| 0.6361111111111112 | 21.024 |
| 0.6368055555555555 | 21.024 |
| 0.6375000000000001 | 16.636 |
| 0.6381944444444444 | 16.636 |
| 0.638888888888889 | 16.636 |
| 0.6395833333333333 | 16.636 |
| 0.6402777777777778 | 16.636 |
| 0.6409722222222222 | 16.636 |
| 0.6416666666666667 | 16.636 |
| 0.642361111111111 | 12.257 |
| 0.6430555555555556 | 16.636 |
| 0.6437499999999999 | 16.636 |
| 0.6444444444444445 | 12.257 |
| 0.6451388888888888 | 12.257 |
| 0.6458333333333334 | 12.257 |
| 0.6465277777777778 | 12.257 |
| 0.6472222222222223 | 12.257 |
| 0.6479166666666667 | 12.257 |
| 0.6486111111111111 | 12.257 |
| 0.6493055555555556 | 12.257 |
| 0.65 | 12.257 |
| 0.6506944444444445 | 12.257 |
| 0.6513888888888889 | 12.257 |
| 0.6520833333333333 | 7.887 |
| 0.6527777777777778 | 12.257 |
| 0.6534722222222222 | 7.887 |
| 0.6541666666666667 | 7.887 |
| 0.6548611111111111 | 7.887 |
| 0.6555555555555556 | 7.887 |
| 0.65625 | 7.887 |
| 0.6569444444444444 | 7.887 |
| 0.6576388888888889 | 7.887 |
| 0.6583333333333333 | 7.887 |
| 0.6590277777777778 | 7.887 |
| 0.6597222222222222 | 7.887 |
| 0.6604166666666667 | 7.887 |
| 0.6611111111111111 | 7.887 |
| 0.6618055555555555 | 7.887 |
| 0.6625 | 7.887 |
| 0.6631944444444444 | 7.887 |
| 0.6638888888888889 | 7.887 |
| 0.6645833333333333 | 3.525 |
| 0.6652777777777777 | 3.525 |
| 0.6659722222222222 | 3.525 |
| 0.6666666666666666 | 3.525 |
| 0.6673611111111111 | 3.525 |
| 0.6680555555555556 | 3.525 |
| 0.6687500000000001 | 3.525 |
| 0.6694444444444444 | 3.525 |
| 0.6701388888888888 | 3.525 |
| 0.6708333333333334 | 3.525 |
| 0.6715277777777778 | 3.525 |
| 0.6722222222222222 | 3.525 |
| 0.6729166666666666 | 3.525 |
| 0.6736111111111112 | 3.525 |
| 0.6743055555555556 | 3.525 |
| 0.6749999999999999 | 3.525 |
| 0.6756944444444444 | 3.525 |
| 0.6763888888888889 | 3.525 |
| 0.6770833333333334 | 3.525 |
| 0.6777777777777777 | 3.525 |
| 0.6784722222222223 | 3.525 |
| 0.6791666666666667 | 3.525 |
| 0.6798611111111111 | 3.525 |
| 0.6805555555555555 | 3.525 |
| 0.68125 | 3.525 |
| 0.6819444444444445 | 3.525 |
| 0.6826388888888889 | 3.525 |
| 0.6833333333333332 | 3.525 |
| 0.6840277777777778 | 3.525 |
| 0.6847222222222222 | 3.525 |
| 0.6854166666666667 | 3.525 |
| 0.686111111111111 | 3.525 |
| 0.6868055555555556 | 3.525 |
| 0.6875 | 3.525 |
| 0.6881944444444444 | 3.525 |
| 0.688888888888889 | 3.525 |
| 0.6895833333333333 | 3.525 |
| 0.6902777777777778 | 3.525 |
| 0.6909722222222222 | 3.525 |
| 0.6916666666666668 | 3.525 |
| 0.6923611111111111 | 3.525 |
| 0.6930555555555555 | 3.525 |
| 0.69375 | 3.525 |
| 0.6944444444444445 | 3.525 |
| 0.6951388888888889 | 0 |
| 0.6958333333333333 | 3.525 |
| 0.6965277777777777 | 0 |
| 0.6972222222222223 | 0 |
| 0.6979166666666666 | 0 |
| 0.6986111111111111 | 0 |
| 0.6993055555555556 | 0 |
| 0.7000000000000001 | 0 |
| 0.7006944444444444 | 0 |
| 0.7013888888888888 | 0 |
| 0.7020833333333334 | 0 |
| 0.7027777777777778 | 0 |
| 0.7034722222222222 | 0 |
| 0.7041666666666666 | 0 |
| 0.7048611111111112 | 0 |
| 0.7055555555555556 | 0 |
| 0.7062499999999999 | 0 |
| 0.7069444444444444 | 0 |
| 0.7076388888888889 | 0 |
| 0.7083333333333334 | 0 |
| 0.7090277777777777 | 0 |
| 0.7097222222222223 | 0 |
| 0.7104166666666667 | 0 |
| 0.7111111111111111 | 0 |
| 0.7118055555555555 | 0 |
| 0.7125 | 0 |
| 0.7131944444444445 | 0 |
| 0.7138888888888889 | 0 |
| 0.7145833333333332 | 0 |
| 0.7152777777777778 | 0 |
| 0.7159722222222222 | 0 |
| 0.7166666666666667 | 0 |
| 0.717361111111111 | 0 |
| 0.7180555555555556 | 0 |
| 0.71875 | 0 |
| 0.7194444444444444 | 0 |
| 0.720138888888889 | 0 |
| 0.7208333333333333 | 0 |
| 0.7215277777777778 | 0 |
| 0.7222222222222222 | 0 |
| 0.7229166666666668 | 0 |
| 0.7236111111111111 | 0 |
| 0.7243055555555555 | 0 |
| 0.725 | 0 |
| 0.7256944444444445 | 0 |
| 0.7263888888888889 | 0 |
| 0.7270833333333333 | 0 |
| 0.7277777777777777 | 0 |
| 0.7284722222222223 | 0 |
| 0.7291666666666666 | 0 |
| 0.7298611111111111 | 0 |
| 0.7305555555555556 | 0 |
| 0.7312500000000001 | 0 |
| 0.7319444444444444 | 0 |
| 0.7326388888888888 | 0 |
| 0.7333333333333334 | 0 |
| 0.7340277777777778 | 0 |
| 0.7347222222222222 | 0 |
| 0.7354166666666666 | 0 |
| 0.7361111111111112 | 0 |
| 0.7368055555555556 | 0 |
| 0.7374999999999999 | 0 |
| 0.7381944444444444 | 0 |
| 0.7388888888888889 | 0 |
| 0.7395833333333334 | 0 |
| 0.7402777777777777 | 0 |
| 0.7409722222222223 | 0 |
| 0.7416666666666667 | 0 |
| 0.7423611111111111 | 0 |
| 0.7430555555555555 | 0 |
| 0.74375 | 0 |
| 0.7444444444444445 | 0 |
| 0.7451388888888889 | 0 |
| 0.7458333333333332 | 0 |
| 0.7465277777777778 | 0 |
| 0.7472222222222222 | 0 |
| 0.7479166666666667 | 0 |
| 0.748611111111111 | 0 |
| 0.7493055555555556 | 0 |
| 0.75 | 0 |
| 0.7506944444444444 | 0 |
| 0.751388888888889 | 0 |
| 0.7520833333333333 | 0 |
| 0.7527777777777778 | 0 |
| 0.7534722222222222 | 0 |
| 0.7541666666666668 | 0 |
| 0.7548611111111111 | 0 |
| 0.7555555555555555 | 0 |
| 0.75625 | 0 |
| 0.7569444444444445 | 0 |
| 0.7576388888888889 | 0 |
| 0.7583333333333333 | 0 |
| 0.7590277777777777 | 0 |
| 0.7597222222222223 | 0 |
| 0.7604166666666666 | 0 |
| 0.7611111111111111 | 0 |
| 0.7618055555555556 | 0 |
| 0.7625000000000001 | 0 |
| 0.7631944444444444 | 0 |
| 0.7638888888888888 | 0 |
| 0.7645833333333334 | 0 |
| 0.7652777777777778 | 0 |
| 0.7659722222222222 | 0 |
| 0.7666666666666666 | 0 |
| 0.7673611111111112 | 0 |
| 0.7680555555555556 | 0 |
| 0.7687499999999999 | 0 |
| 0.7694444444444444 | 0 |
| 0.7701388888888889 | 0 |
| 0.7708333333333334 | 0 |
| 0.7715277777777777 | 0 |
| 0.7722222222222223 | 0 |
| 0.7729166666666667 | 0 |
| 0.7736111111111111 | 0 |
| 0.7743055555555555 | 0 |
| 0.775 | 0 |
| 0.7756944444444445 | 0 |
| 0.7763888888888889 | 0 |
| 0.7770833333333332 | 0 |
| 0.7777777777777778 | 0 |
| 0.7784722222222222 | 0 |
| 0.7791666666666667 | 0 |
| 0.779861111111111 | 0 |
| 0.7805555555555556 | 0 |
| 0.78125 | 0 |
| 0.7819444444444444 | 0 |
| 0.782638888888889 | 0 |
| 0.7833333333333333 | 0 |
| 0.7840277777777778 | 0 |
| 0.7847222222222222 | 0 |
| 0.7854166666666668 | 0 |
| 0.7861111111111111 | 0 |
| 0.7868055555555555 | 0 |
| 0.7875 | 0 |
| 0.7881944444444445 | 0 |
| 0.7888888888888889 | 0 |
| 0.7895833333333333 | 0 |
| 0.7902777777777777 | 0 |
| 0.7909722222222223 | 0 |
| 0.7916666666666666 | 0 |
| 0.7923611111111111 | 0 |
| 0.7930555555555556 | 0 |
| 0.7937500000000001 | 0 |
| 0.7944444444444444 | 0 |
| 0.7951388888888888 | 0 |
| 0.7958333333333334 | 0 |
| 0.7965277777777778 | 0 |
| 0.7972222222222222 | 0 |
| 0.7979166666666666 | 0 |
| 0.7986111111111112 | 0 |
| 0.7993055555555556 | 0 |
| 0.7999999999999999 | 0 |
| 0.8006944444444444 | 0 |
| 0.8013888888888889 | 0 |
| 0.8020833333333334 | 0 |
| 0.8027777777777777 | 0 |
| 0.8034722222222223 | 0 |
| 0.8041666666666667 | 0 |
| 0.8048611111111111 | 0 |
| 0.8055555555555555 | 0 |
| 0.80625 | 0 |
| 0.8069444444444445 | 0 |
| 0.8076388888888889 | 0 |
| 0.8083333333333332 | 0 |
| 0.8090277777777778 | 0 |
| 0.8097222222222222 | 0 |
| 0.8104166666666667 | 0 |
| 0.811111111111111 | 0 |
| 0.8118055555555556 | 0 |
| 0.8125 | 0 |
| 0.8131944444444444 | 0 |
| 0.813888888888889 | 0 |
| 0.8145833333333333 | 0 |
| 0.8152777777777778 | 0 |
| 0.8159722222222222 | 0 |
| 0.8166666666666668 | 0 |
| 0.8173611111111111 | 0 |
| 0.8180555555555555 | 0 |
| 0.81875 | 0 |
| 0.8194444444444445 | 0 |
| 0.8201388888888889 | 0 |
| 0.8208333333333333 | 0 |
| 0.8215277777777777 | 0 |
| 0.8222222222222223 | 0 |
| 0.8229166666666666 | 0 |
| 0.8236111111111111 | 0 |
| 0.8243055555555556 | 0 |
| 0.8250000000000001 | 0 |
| 0.8256944444444444 | 0 |
| 0.8263888888888888 | 0 |
| 0.8270833333333334 | 0 |
| 0.8277777777777778 | 0 |
| 0.8284722222222222 | 0 |
| 0.8291666666666666 | 0 |
| 0.8298611111111112 | 0 |
| 0.8305555555555556 | 0 |
| 0.8312499999999999 | 0 |
| 0.8319444444444444 | 0 |
| 0.8326388888888889 | 0 |
| 0.8333333333333334 | 0 |
| 0.8340277777777777 | 0 |
| 0.8347222222222223 | 0 |
| 0.8354166666666667 | 0 |
| 0.8361111111111111 | 0 |
| 0.8368055555555555 | 0 |
| 0.8375 | 0 |
| 0.8381944444444445 | 0 |
| 0.8388888888888889 | 0 |
| 0.8395833333333332 | 0 |
| 0.8402777777777778 | 0 |
| 0.8409722222222222 | 0 |
| 0.8416666666666667 | 0 |
| 0.842361111111111 | 0 |
| 0.8430555555555556 | 0 |
| 0.84375 | 0 |
| 0.8444444444444444 | 0 |
| 0.845138888888889 | 0 |
| 0.8458333333333333 | 0 |
| 0.8465277777777778 | 0 |
| 0.8472222222222222 | 0 |
| 0.8479166666666668 | 0 |
| 0.8486111111111111 | 0 |
| 0.8493055555555555 | 0 |
| 0.85 | 0 |
| 0.8506944444444445 | 0 |
| 0.8513888888888889 | 0 |
| 0.8520833333333333 | 0 |
| 0.8527777777777777 | 0 |
| 0.8534722222222223 | 0 |
| 0.8541666666666666 | 0 |
| 0.8548611111111111 | 0 |
| 0.8555555555555556 | 0 |
| 0.8562500000000001 | 0 |
| 0.8569444444444444 | 0 |
| 0.8576388888888888 | 0 |
| 0.8583333333333334 | 0 |
| 0.8590277777777778 | 0 |
| 0.8597222222222222 | 0 |
| 0.8604166666666666 | 0 |
| 0.8611111111111112 | 0 |
| 0.8618055555555556 | 0 |
| 0.8624999999999999 | 0 |
| 0.8631944444444444 | 0 |
| 0.8638888888888889 | 0 |
| 0.8645833333333334 | 0 |
| 0.8652777777777777 | 0 |
| 0.8659722222222223 | 0 |
| 0.8666666666666667 | 0 |
| 0.8673611111111111 | 0 |
| 0.8680555555555555 | 0 |
| 0.86875 | 0 |
| 0.8694444444444445 | 0 |
| 0.8701388888888889 | 0 |
| 0.8708333333333332 | 0 |
| 0.8715277777777778 | 0 |
| 0.8722222222222222 | 0 |
| 0.8729166666666667 | 0 |
| 0.873611111111111 | 0 |
| 0.8743055555555556 | 0 |
| 0.875 | 0 |
| 0.8756944444444444 | 0 |
| 0.876388888888889 | 0 |
| 0.8770833333333333 | 0 |
| 0.8777777777777778 | 0 |
| 0.8784722222222222 | 0 |
| 0.8791666666666668 | 0 |
| 0.8798611111111111 | 0 |
| 0.8805555555555555 | 0 |
| 0.88125 | 0 |
| 0.8819444444444445 | 0 |
| 0.8826388888888889 | 0 |
| 0.8833333333333333 | 0 |
| 0.8840277777777777 | 0 |
| 0.8847222222222223 | 0 |
| 0.8854166666666666 | 0 |
| 0.8861111111111111 | 0 |
| 0.8868055555555556 | 0 |
| 0.8875000000000001 | 0 |
| 0.8881944444444444 | 0 |
| 0.8888888888888888 | 0 |
| 0.8895833333333334 | 0 |
| 0.8902777777777778 | 0 |
| 0.8909722222222222 | 0 |
| 0.8916666666666666 | 0 |
| 0.8923611111111112 | 0 |
| 0.8930555555555556 | 0 |
| 0.8937499999999999 | 0 |
| 0.8944444444444444 | 0 |
| 0.8951388888888889 | 0 |
| 0.8958333333333334 | 0 |
| 0.8965277777777777 | 0 |
| 0.8972222222222223 | 0 |
| 0.8979166666666667 | 0 |
| 0.8986111111111111 | 0 |
| 0.8993055555555555 | 0 |
| 0.9 | 0 |
| 0.9006944444444445 | 0 |
| 0.9013888888888889 | 0 |
| 0.9020833333333332 | 0 |
| 0.9027777777777778 | 0 |
| 0.9034722222222222 | 0 |
| 0.9041666666666667 | 0 |
| 0.904861111111111 | 0 |
| 0.9055555555555556 | 0 |
| 0.90625 | 0 |
| 0.9069444444444444 | 0 |
| 0.907638888888889 | 0 |
| 0.9083333333333333 | 0 |
| 0.9090277777777778 | 0 |
| 0.9097222222222222 | 0 |
| 0.9104166666666668 | 0 |
| 0.9111111111111111 | 0 |
| 0.9118055555555555 | 0 |
| 0.9125 | 0 |
| 0.9131944444444445 | 0 |
| 0.9138888888888889 | 0 |
| 0.9145833333333333 | 0 |
| 0.9152777777777777 | 0 |
| 0.9159722222222223 | 0 |
| 0.9166666666666666 | 0 |
| 0.9173611111111111 | 0 |
| 0.9180555555555556 | 0 |
| 0.9187500000000001 | 0 |
| 0.9194444444444444 | 0 |
| 0.9201388888888888 | 0 |
| 0.9208333333333334 | 0 |
| 0.9215277777777778 | 0 |
| 0.9222222222222222 | 0 |
| 0.9229166666666666 | 0 |
| 0.9236111111111112 | 0 |
| 0.9243055555555556 | 0 |
| 0.9249999999999999 | 0 |
| 0.9256944444444444 | 0 |
| 0.9263888888888889 | 0 |
| 0.9270833333333334 | 0 |
| 0.9277777777777777 | 0 |
| 0.9284722222222223 | 0 |
| 0.9291666666666667 | 0 |
| 0.9298611111111111 | 0 |
| 0.9305555555555555 | 0 |
| 0.93125 | 0 |
| 0.9319444444444445 | 0 |
| 0.9326388888888889 | 0 |
| 0.9333333333333332 | 0 |
| 0.9340277777777778 | 0 |
| 0.9347222222222222 | 0 |
| 0.9354166666666667 | 0 |
| 0.936111111111111 | 0 |
| 0.9368055555555556 | 0 |
| 0.9375 | 0 |
| 0.9381944444444444 | 0 |
| 0.938888888888889 | 0 |
| 0.9395833333333333 | 0 |
| 0.9402777777777778 | 0 |
| 0.9409722222222222 | 0 |
| 0.9416666666666668 | 0 |
| 0.9423611111111111 | 0 |
| 0.9430555555555555 | 0 |
| 0.94375 | 0 |
| 0.9444444444444445 | 0 |
| 0.9451388888888889 | 0 |
| 0.9458333333333333 | 0 |
| 0.9465277777777777 | 0 |
| 0.9472222222222223 | 0 |
| 0.9479166666666666 | 0 |
| 0.9486111111111111 | 0 |
| 0.9493055555555556 | 0 |
| 0.9500000000000001 | 0 |
| 0.9506944444444444 | 0 |
| 0.9513888888888888 | 0 |
| 0.9520833333333334 | 0 |
| 0.9527777777777778 | 0 |
| 0.9534722222222222 | 0 |
| 0.9541666666666666 | 0 |
| 0.9548611111111112 | 0 |
| 0.9555555555555556 | 0 |
| 0.9562499999999999 | 0 |
| 0.9569444444444444 | 0 |
| 0.9576388888888889 | 0 |
| 0.9583333333333334 | 0 |
| 0.9590277777777777 | 0 |
| 0.9597222222222223 | 0 |
| 0.9604166666666667 | 0 |
| 0.9611111111111111 | 0 |
| 0.9618055555555555 | 0 |
| 0.9625 | 0 |
| 0.9631944444444445 | 0 |
| 0.9638888888888889 | 0 |
| 0.9645833333333332 | 0 |
| 0.9652777777777778 | 0 |
| 0.9659722222222222 | 0 |
| 0.9666666666666667 | 0 |
| 0.967361111111111 | 0 |
| 0.9680555555555556 | 0 |
| 0.96875 | 0 |
| 0.9694444444444444 | 0 |
| 0.970138888888889 | 0 |
| 0.9708333333333333 | 0 |
| 0.9715277777777778 | 0 |
| 0.9722222222222222 | 0 |
| 0.9729166666666668 | 0 |
| 0.9736111111111111 | 0 |
| 0.9743055555555555 | 0 |
| 0.975 | 0 |
| 0.9756944444444445 | 0 |
| 0.9763888888888889 | 0 |
| 0.9770833333333333 | 0 |
| 0.9777777777777777 | 0 |
| 0.9784722222222223 | 0 |
| 0.9791666666666666 | 0 |
| 0.9798611111111111 | 0 |
| 0.9805555555555556 | 0 |
| 0.9812500000000001 | 0 |
| 0.9819444444444444 | 0 |
| 0.9826388888888888 | 0 |
| 0.9833333333333334 | 0 |
| 0.9840277777777778 | 0 |
| 0.9847222222222222 | 0 |
| 0.9854166666666666 | 0 |
| 0.9861111111111112 | 0 |
| 0.9868055555555556 | 0 |
| 0.9874999999999999 | 0 |
| 0.9881944444444444 | 0 |
| 0.9888888888888889 | 0 |
| 0.9895833333333334 | 0 |
| 0.9902777777777777 | 0 |
| 0.9909722222222223 | 0 |
| 0.9916666666666667 | 0 |
| 0.9923611111111111 | 0 |
| 0.9930555555555555 | 0 |
| 0.99375 | 0 |
| 0.9944444444444445 | 0 |
| 0.9951388888888889 | 0 |
| 0.9958333333333332 | 0 |
| 0.9965277777777778 | 0 |
| 0.9972222222222222 | 0 |
| 0.9979166666666667 | 0 |
| 0.998611111111111 | 0 |
| 0.9993055555555556 | 0 |